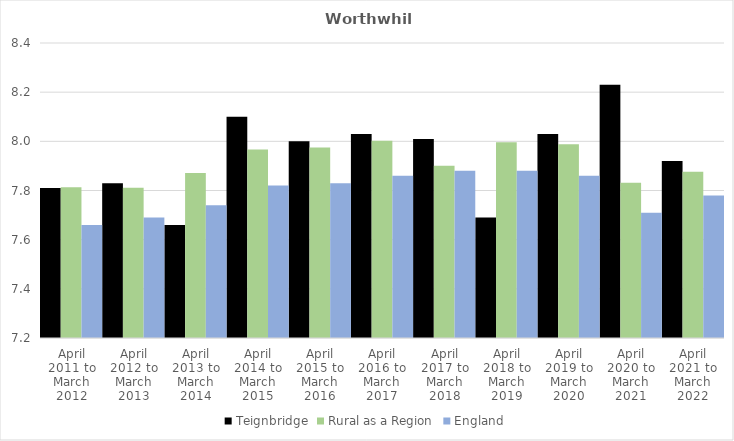
| Category | Teignbridge | Rural as a Region | England |
|---|---|---|---|
| April 2011 to March 2012 | 7.81 | 7.813 | 7.66 |
| April 2012 to March 2013 | 7.83 | 7.811 | 7.69 |
| April 2013 to March 2014 | 7.66 | 7.871 | 7.74 |
| April 2014 to March 2015 | 8.1 | 7.967 | 7.82 |
| April 2015 to March 2016 | 8 | 7.975 | 7.83 |
| April 2016 to March 2017 | 8.03 | 8.002 | 7.86 |
| April 2017 to March 2018 | 8.01 | 7.9 | 7.88 |
| April 2018 to March 2019 | 7.69 | 7.996 | 7.88 |
| April 2019 to March 2020 | 8.03 | 7.988 | 7.86 |
| April 2020 to March 2021 | 8.23 | 7.831 | 7.71 |
| April 2021 to March 2022 | 7.92 | 7.877 | 7.78 |